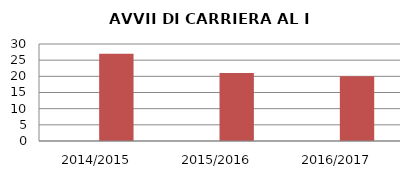
| Category | ANNO | NUMERO |
|---|---|---|
| 2014/2015 | 0 | 27 |
| 2015/2016 | 0 | 21 |
| 2016/2017 | 0 | 20 |